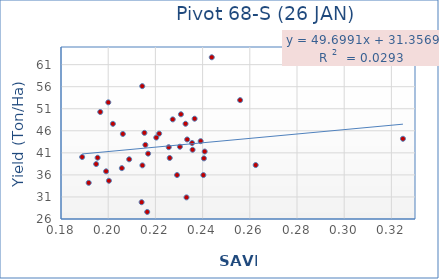
| Category | Series 0 |
|---|---|
| 0.324893 | 44.193 |
| 0.227344 | 48.59 |
| 0.221592 | 45.357 |
| 0.220374 | 44.457 |
| 0.195508 | 39.897 |
| 0.201988 | 47.577 |
| 0.194894 | 38.457 |
| 0.208886 | 39.537 |
| 0.215343 | 45.533 |
| 0.21653 | 27.6 |
| 0.216913 | 40.82 |
| 0.232769 | 47.593 |
| 0.23346 | 44.033 |
| 0.233176 | 30.9 |
| 0.240317 | 36.813 |
| 0.239187 | 35.96 |
| 0.235542 | 43.65 |
| 0.21575 | 43.227 |
| 0.230819 | 42.803 |
| 0.262496 | 49.743 |
| 0.236622 | 38.233 |
| 0.240886 | 48.74 |
| 0.206205 | 41.3 |
| 0.191741 | 45.283 |
| 0.205783 | 34.2 |
| 0.214162 | 40.053 |
| 0.200303 | 37.533 |
| 0.196632 | 29.81 |
| 0.214497 | 34.667 |
| 0.243888 | 50.267 |
| 0.230384 | 38.16 |
| 0.240561 | 39.84 |
| 0.229175 | 62.667 |
| 0.214422 | 42.387 |
| 0.225657 | 39.747 |
| 0.200041 | 35.967 |
| 0.255895 | 56.123 |
| 0.235755 | 42.28 |
| 0.246821 | 52.45 |
| 0.269389 | 52.953 |
| 0.246171 | 41.7 |